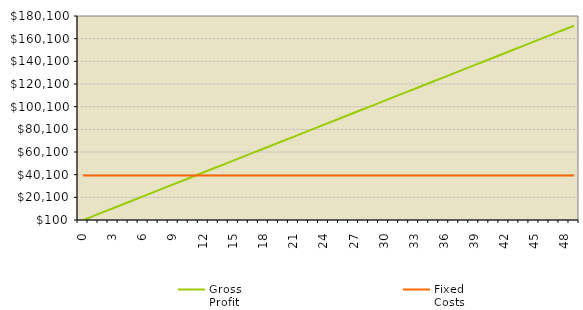
| Category | Gross
Profit | Fixed
Costs |
|---|---|---|
| 0.0 | 0 | 39401.25 |
| 1.0 | 3500 | 39401.25 |
| 2.0 | 7000 | 39401.25 |
| 3.0 | 10500 | 39401.25 |
| 4.0 | 14000 | 39401.25 |
| 5.0 | 17500 | 39401.25 |
| 6.0 | 21000 | 39401.25 |
| 7.0 | 24500 | 39401.25 |
| 8.0 | 28000 | 39401.25 |
| 9.0 | 31500 | 39401.25 |
| 10.0 | 35000 | 39401.25 |
| 11.0 | 38500 | 39401.25 |
| 12.0 | 42000 | 39401.25 |
| 13.0 | 45500 | 39401.25 |
| 14.0 | 49000 | 39401.25 |
| 15.0 | 52500 | 39401.25 |
| 16.0 | 56000 | 39401.25 |
| 17.0 | 59500 | 39401.25 |
| 18.0 | 63000 | 39401.25 |
| 19.0 | 66500 | 39401.25 |
| 20.0 | 70000 | 39401.25 |
| 21.0 | 73500 | 39401.25 |
| 22.0 | 77000 | 39401.25 |
| 23.0 | 80500 | 39401.25 |
| 24.0 | 84000 | 39401.25 |
| 25.0 | 87500 | 39401.25 |
| 26.0 | 91000 | 39401.25 |
| 27.0 | 94500 | 39401.25 |
| 28.0 | 98000 | 39401.25 |
| 29.0 | 101500 | 39401.25 |
| 30.0 | 105000 | 39401.25 |
| 31.0 | 108500 | 39401.25 |
| 32.0 | 112000 | 39401.25 |
| 33.0 | 115500 | 39401.25 |
| 34.0 | 119000 | 39401.25 |
| 35.0 | 122500 | 39401.25 |
| 36.0 | 126000 | 39401.25 |
| 37.0 | 129500 | 39401.25 |
| 38.0 | 133000 | 39401.25 |
| 39.0 | 136500 | 39401.25 |
| 40.0 | 140000 | 39401.25 |
| 41.0 | 143500 | 39401.25 |
| 42.0 | 147000 | 39401.25 |
| 43.0 | 150500 | 39401.25 |
| 44.0 | 154000 | 39401.25 |
| 45.0 | 157500 | 39401.25 |
| 46.0 | 161000 | 39401.25 |
| 47.0 | 164500 | 39401.25 |
| 48.0 | 168000 | 39401.25 |
| 49.0 | 171500 | 39401.25 |